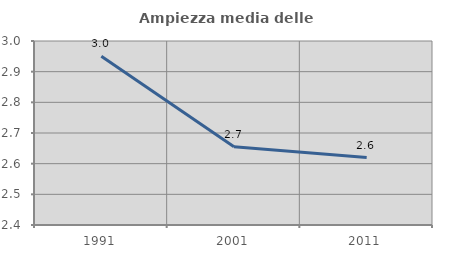
| Category | Ampiezza media delle famiglie |
|---|---|
| 1991.0 | 2.951 |
| 2001.0 | 2.655 |
| 2011.0 | 2.62 |